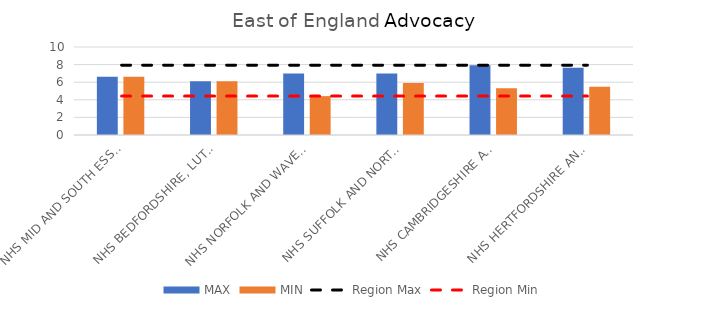
| Category | MAX | MIN |
|---|---|---|
| NHS MID AND SOUTH ESSEX INTEGRATED CARE BOARD | 6.61 | 6.61 |
| NHS BEDFORDSHIRE, LUTON AND MILTON KEYNES INTEGRATED CARE BOARD | 6.118 | 6.118 |
| NHS NORFOLK AND WAVENEY INTEGRATED CARE BOARD | 6.977 | 4.418 |
| NHS SUFFOLK AND NORTH EAST ESSEX INTEGRATED CARE BOARD | 6.977 | 5.913 |
| NHS CAMBRIDGESHIRE AND PETERBOROUGH INTEGRATED CARE BOARD | 7.938 | 5.323 |
| NHS HERTFORDSHIRE AND WEST ESSEX INTEGRATED CARE BOARD | 7.647 | 5.492 |